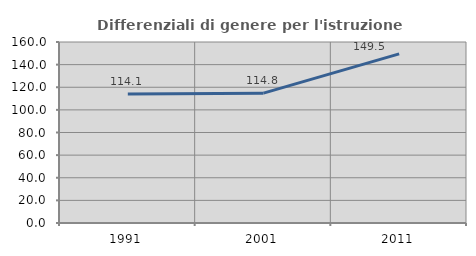
| Category | Differenziali di genere per l'istruzione superiore |
|---|---|
| 1991.0 | 114.09 |
| 2001.0 | 114.774 |
| 2011.0 | 149.53 |